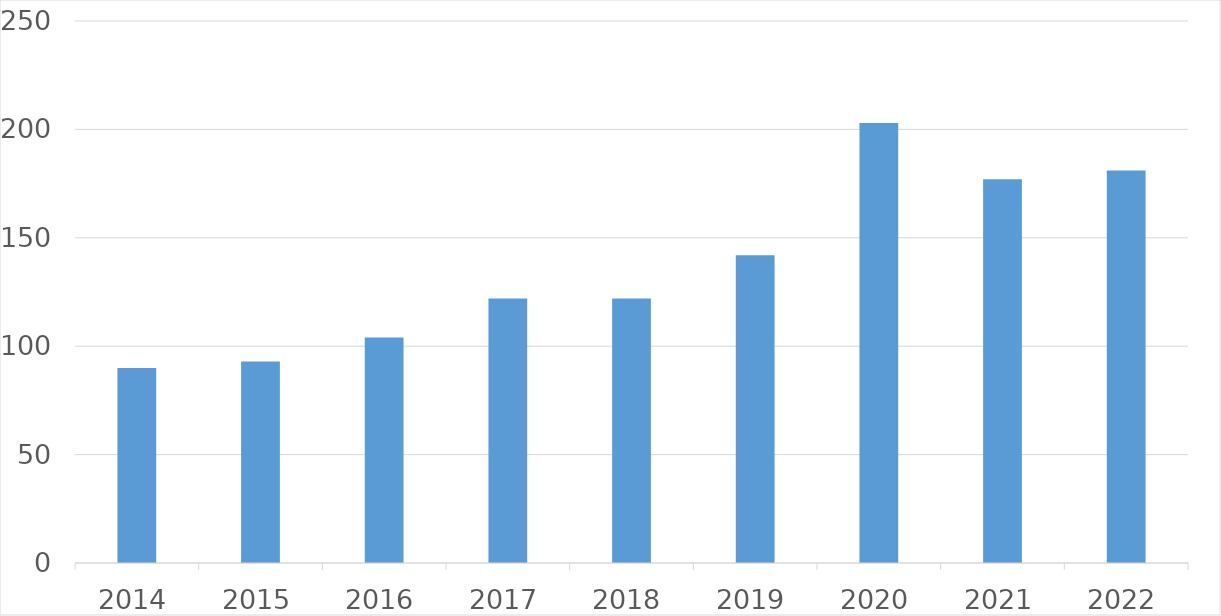
| Category | Series 0 |
|---|---|
| 2014 | 90 |
| 2015 | 93 |
| 2016 | 104 |
| 2017 | 122 |
| 2018 | 122 |
| 2019 | 142 |
| 2020 | 203 |
| 2021 | 177 |
| 2022 | 181 |